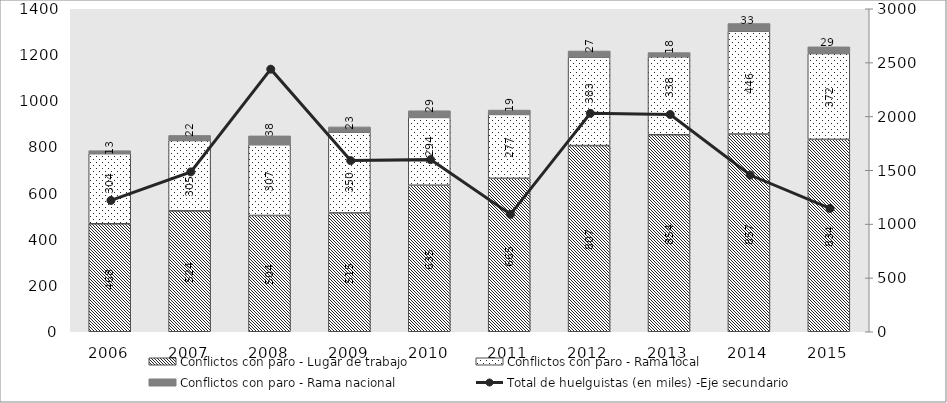
| Category | Conflictos con paro - Lugar de trabajo | Conflictos con paro - Rama local | Conflictos con paro - Rama nacional |
|---|---|---|---|
| 2006.0 | 468 | 304 | 13 |
| 2007.0 | 524 | 305 | 22 |
| 2008.0 | 504 | 307 | 38 |
| 2009.0 | 515 | 350 | 23 |
| 2010.0 | 635 | 294 | 29 |
| 2011.0 | 665 | 277 | 19 |
| 2012.0 | 807 | 383 | 27 |
| 2013.0 | 854 | 338 | 18 |
| 2014.0 | 857 | 446 | 33 |
| 2015.0 | 834 | 372 | 29 |